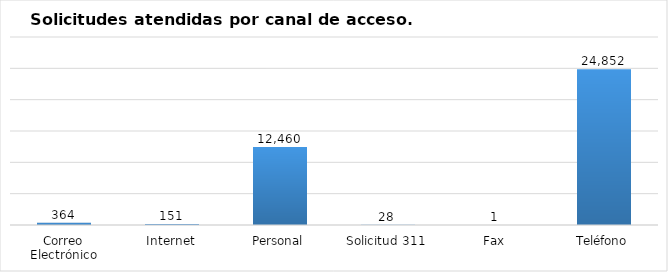
| Category | Total |
|---|---|
| Correo Electrónico | 364 |
| Internet | 151 |
| Personal | 12460 |
| Solicitud 311 | 28 |
| Fax | 1 |
| Teléfono | 24852 |